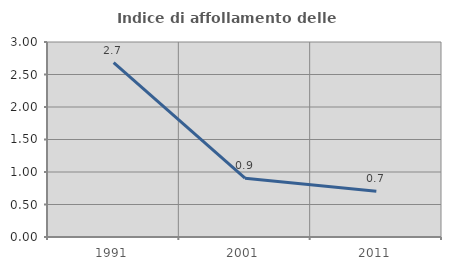
| Category | Indice di affollamento delle abitazioni  |
|---|---|
| 1991.0 | 2.684 |
| 2001.0 | 0.904 |
| 2011.0 | 0.704 |